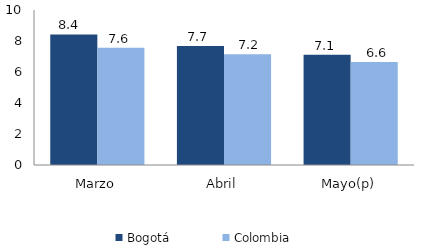
| Category | Bogotá | Colombia |
|---|---|---|
| Marzo | 8.426 | 7.558 |
| Abril | 7.67 | 7.152 |
| Mayo(p) | 7.109 | 6.644 |